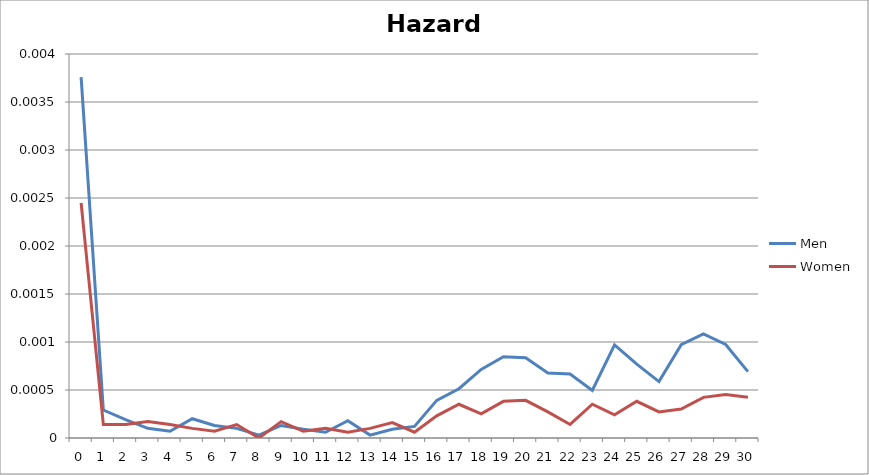
| Category | Men | Women |
|---|---|---|
| 0.0 | 0.004 | 0.002 |
| 1.0 | 0 | 0 |
| 2.0 | 0 | 0 |
| 3.0 | 0 | 0 |
| 4.0 | 0 | 0 |
| 5.0 | 0 | 0 |
| 6.0 | 0 | 0 |
| 7.0 | 0 | 0 |
| 8.0 | 0 | 0 |
| 9.0 | 0 | 0 |
| 10.0 | 0 | 0 |
| 11.0 | 0 | 0 |
| 12.0 | 0 | 0 |
| 13.0 | 0 | 0 |
| 14.0 | 0 | 0 |
| 15.0 | 0 | 0 |
| 16.0 | 0 | 0 |
| 17.0 | 0.001 | 0 |
| 18.0 | 0.001 | 0 |
| 19.0 | 0.001 | 0 |
| 20.0 | 0.001 | 0 |
| 21.0 | 0.001 | 0 |
| 22.0 | 0.001 | 0 |
| 23.0 | 0 | 0 |
| 24.0 | 0.001 | 0 |
| 25.0 | 0.001 | 0 |
| 26.0 | 0.001 | 0 |
| 27.0 | 0.001 | 0 |
| 28.0 | 0.001 | 0 |
| 29.0 | 0.001 | 0 |
| 30.0 | 0.001 | 0 |